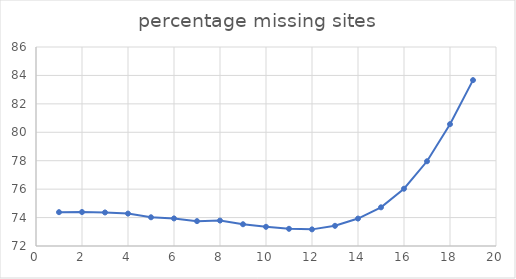
| Category | Series 0 |
|---|---|
| 0 | 74.38 |
| 1 | 74.39 |
| 2 | 74.36 |
| 3 | 74.28 |
| 4 | 74.02 |
| 5 | 73.94 |
| 6 | 73.75 |
| 7 | 73.79 |
| 8 | 73.53 |
| 9 | 73.35 |
| 10 | 73.21 |
| 11 | 73.17 |
| 12 | 73.42 |
| 13 | 73.93 |
| 14 | 74.72 |
| 15 | 76.03 |
| 16 | 77.96 |
| 17 | 80.57 |
| 18 | 83.67 |